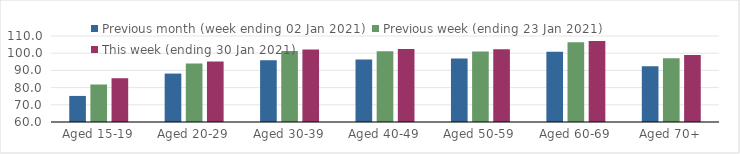
| Category | Previous month (week ending 02 Jan 2021) | Previous week (ending 23 Jan 2021) | This week (ending 30 Jan 2021) |
|---|---|---|---|
| Aged 15-19 | 75.16 | 81.8 | 85.45 |
| Aged 20-29 | 88.16 | 93.97 | 95.22 |
| Aged 30-39 | 95.9 | 101.23 | 102.08 |
| Aged 40-49 | 96.37 | 101.15 | 102.41 |
| Aged 50-59 | 96.94 | 101.02 | 102.3 |
| Aged 60-69 | 100.9 | 106.39 | 107.03 |
| Aged 70+ | 92.35 | 97.04 | 99 |